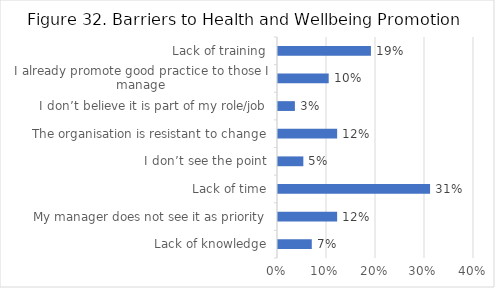
| Category | Series 0 |
|---|---|
| Lack of knowledge | 0.069 |
| My manager does not see it as priority | 0.121 |
| Lack of time | 0.31 |
| I don’t see the point | 0.052 |
| The organisation is resistant to change | 0.121 |
| I don’t believe it is part of my role/job | 0.034 |
| I already promote good practice to those I manage | 0.103 |
| Lack of training | 0.19 |